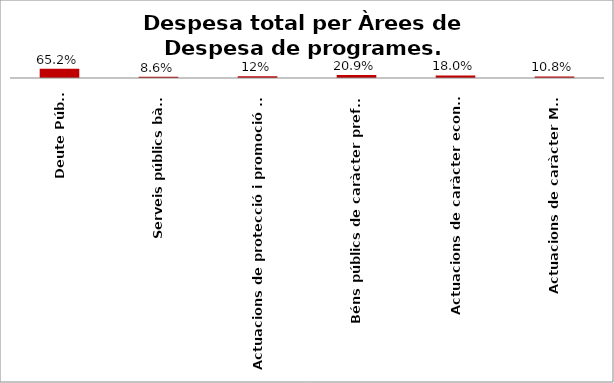
| Category | Series 0 |
|---|---|
| Deute Públic | 0.652 |
| Serveis públics bàsics | 0.086 |
| Actuacions de protecció i promoció social | 0.12 |
| Béns públics de caràcter preferent | 0.209 |
| Actuacions de caràcter econòmic | 0.18 |
| Actuacions de caràcter Marçal | 0.108 |